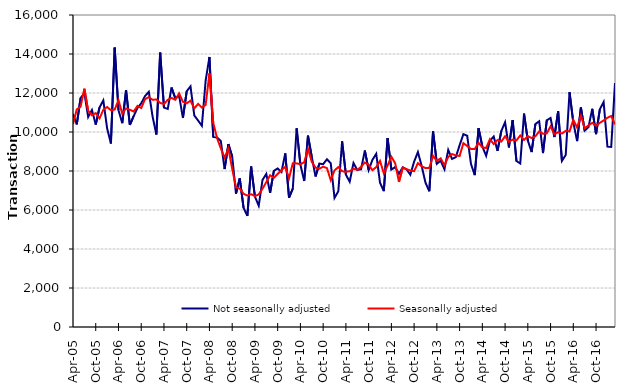
| Category | Not seasonally adjusted | Seasonally adjusted |
|---|---|---|
| 2005-04-01 | 10920 | 10410 |
| 2005-05-01 | 10390 | 11160 |
| 2005-06-01 | 11740 | 11300 |
| 2005-07-01 | 12000 | 12220 |
| 2005-08-01 | 10770 | 11090 |
| 2005-09-01 | 11130 | 10860 |
| 2005-10-01 | 10380 | 10970 |
| 2005-11-01 | 11260 | 10700 |
| 2005-12-01 | 11620 | 11140 |
| 2006-01-01 | 10190 | 11280 |
| 2006-02-01 | 9410 | 11120 |
| 2006-03-01 | 14330 | 11150 |
| 2006-04-01 | 11120 | 11630 |
| 2006-05-01 | 10450 | 10940 |
| 2006-06-01 | 12150 | 11210 |
| 2006-07-01 | 10360 | 11140 |
| 2006-08-01 | 10810 | 11050 |
| 2006-09-01 | 11230 | 11340 |
| 2006-10-01 | 11470 | 11230 |
| 2006-11-01 | 11840 | 11680 |
| 2006-12-01 | 12060 | 11790 |
| 2007-01-01 | 10790 | 11650 |
| 2007-02-01 | 9870 | 11670 |
| 2007-03-01 | 14070 | 11490 |
| 2007-04-01 | 11250 | 11430 |
| 2007-05-01 | 11180 | 11650 |
| 2007-06-01 | 12280 | 11750 |
| 2007-07-01 | 11720 | 11650 |
| 2007-08-01 | 11860 | 11980 |
| 2007-09-01 | 10720 | 11550 |
| 2007-10-01 | 12090 | 11470 |
| 2007-11-01 | 12340 | 11610 |
| 2007-12-01 | 10850 | 11210 |
| 2008-01-01 | 10590 | 11440 |
| 2008-02-01 | 10320 | 11250 |
| 2008-03-01 | 12640 | 11390 |
| 2008-04-01 | 13850 | 13010 |
| 2008-05-01 | 9750 | 10470 |
| 2008-06-01 | 9720 | 9690 |
| 2008-07-01 | 9540 | 9160 |
| 2008-08-01 | 8100 | 8680 |
| 2008-09-01 | 9380 | 9160 |
| 2008-10-01 | 8740 | 8110 |
| 2008-11-01 | 6840 | 7160 |
| 2008-12-01 | 7620 | 7100 |
| 2009-01-01 | 6110 | 6830 |
| 2009-02-01 | 5700 | 6740 |
| 2009-03-01 | 8230 | 6810 |
| 2009-04-01 | 6690 | 6710 |
| 2009-05-01 | 6220 | 6800 |
| 2009-06-01 | 7540 | 7090 |
| 2009-07-01 | 7850 | 7430 |
| 2009-08-01 | 6880 | 7780 |
| 2009-09-01 | 8010 | 7650 |
| 2009-10-01 | 8130 | 7850 |
| 2009-11-01 | 7950 | 8040 |
| 2009-12-01 | 8900 | 8220 |
| 2010-01-01 | 6630 | 7630 |
| 2010-02-01 | 7100 | 8400 |
| 2010-03-01 | 10190 | 8390 |
| 2010-04-01 | 8320 | 8350 |
| 2010-05-01 | 7490 | 8450 |
| 2010-06-01 | 9810 | 9140 |
| 2010-07-01 | 8720 | 8470 |
| 2010-08-01 | 7720 | 8170 |
| 2010-09-01 | 8380 | 8120 |
| 2010-10-01 | 8350 | 8220 |
| 2010-11-01 | 8600 | 8150 |
| 2010-12-01 | 8400 | 7530 |
| 2011-01-01 | 6620 | 8030 |
| 2011-02-01 | 6960 | 8200 |
| 2011-03-01 | 9520 | 7990 |
| 2011-04-01 | 7810 | 7960 |
| 2011-05-01 | 7450 | 7990 |
| 2011-06-01 | 8410 | 8110 |
| 2011-07-01 | 8050 | 8060 |
| 2011-08-01 | 8090 | 8210 |
| 2011-09-01 | 9050 | 8440 |
| 2011-10-01 | 8050 | 8320 |
| 2011-11-01 | 8570 | 8040 |
| 2011-12-01 | 8880 | 8200 |
| 2012-01-01 | 7400 | 8520 |
| 2012-02-01 | 6970 | 7880 |
| 2012-03-01 | 9690 | 8280 |
| 2012-04-01 | 8070 | 8730 |
| 2012-05-01 | 8200 | 8400 |
| 2012-06-01 | 7850 | 7440 |
| 2012-07-01 | 8190 | 8170 |
| 2012-08-01 | 8090 | 8090 |
| 2012-09-01 | 7810 | 8030 |
| 2012-10-01 | 8480 | 7990 |
| 2012-11-01 | 8970 | 8400 |
| 2012-12-01 | 8250 | 8240 |
| 2013-01-01 | 7400 | 8150 |
| 2013-02-01 | 6960 | 8160 |
| 2013-03-01 | 10030 | 8780 |
| 2013-04-01 | 8370 | 8520 |
| 2013-05-01 | 8530 | 8650 |
| 2013-06-01 | 8090 | 8300 |
| 2013-07-01 | 9080 | 8720 |
| 2013-08-01 | 8620 | 8870 |
| 2013-09-01 | 8710 | 8800 |
| 2013-10-01 | 9320 | 8770 |
| 2013-11-01 | 9890 | 9430 |
| 2013-12-01 | 9810 | 9280 |
| 2014-01-01 | 8360 | 9130 |
| 2014-02-01 | 7790 | 9130 |
| 2014-03-01 | 10200 | 9450 |
| 2014-04-01 | 9260 | 9210 |
| 2014-05-01 | 8780 | 9180 |
| 2014-06-01 | 9550 | 9630 |
| 2014-07-01 | 9770 | 9380 |
| 2014-08-01 | 9030 | 9590 |
| 2014-09-01 | 10050 | 9510 |
| 2014-10-01 | 10500 | 9780 |
| 2014-11-01 | 9210 | 9500 |
| 2014-12-01 | 10610 | 9610 |
| 2015-01-01 | 8510 | 9570 |
| 2015-02-01 | 8380 | 9820 |
| 2015-03-01 | 10940 | 9590 |
| 2015-04-01 | 9560 | 9790 |
| 2015-05-01 | 8970 | 9690 |
| 2015-06-01 | 10410 | 9780 |
| 2015-07-01 | 10550 | 10030 |
| 2015-08-01 | 8920 | 9910 |
| 2015-09-01 | 10600 | 9930 |
| 2015-10-01 | 10720 | 10290 |
| 2015-11-01 | 9740 | 9880 |
| 2015-12-01 | 11070 | 9990 |
| 2016-01-01 | 8520 | 9920 |
| 2016-02-01 | 8820 | 10060 |
| 2016-03-01 | 12040 | 10030 |
| 2016-04-01 | 10490 | 10620 |
| 2016-05-01 | 9530 | 10230 |
| 2016-06-01 | 11260 | 10840 |
| 2016-07-01 | 10070 | 10190 |
| 2016-08-01 | 10250 | 10340 |
| 2016-09-01 | 11190 | 10470 |
| 2016-10-01 | 9890 | 10320 |
| 2016-11-01 | 11160 | 10470 |
| 2016-12-01 | 11540 | 10590 |
| 2017-01-01 | 9250 | 10730 |
| 2017-02-01 | 9230 | 10820 |
| 2017-03-01 | 12510 | 10390 |